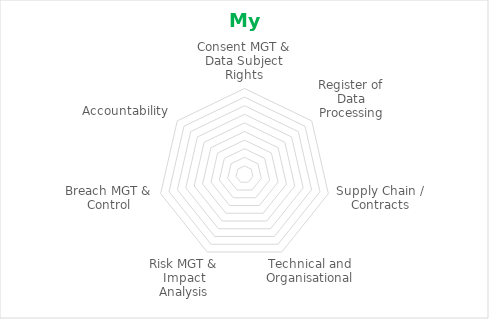
| Category | Series 0 |
|---|---|
| Consent MGT & Data Subject Rights | 0 |
| Register of Data Processing | 0 |
| Supply Chain / Contracts | 0 |
| Technical and Organisational | 0 |
| Risk MGT & Impact Analysis | 0 |
| Breach MGT & Control | 0 |
| Accountability | 0 |